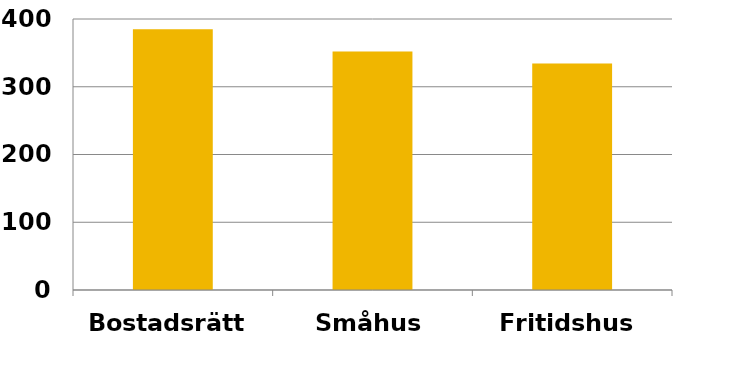
| Category | 2014 |
|---|---|
| Bostadsrätt | 385.044 |
| Småhus | 352.072 |
| Fritidshus | 334.458 |